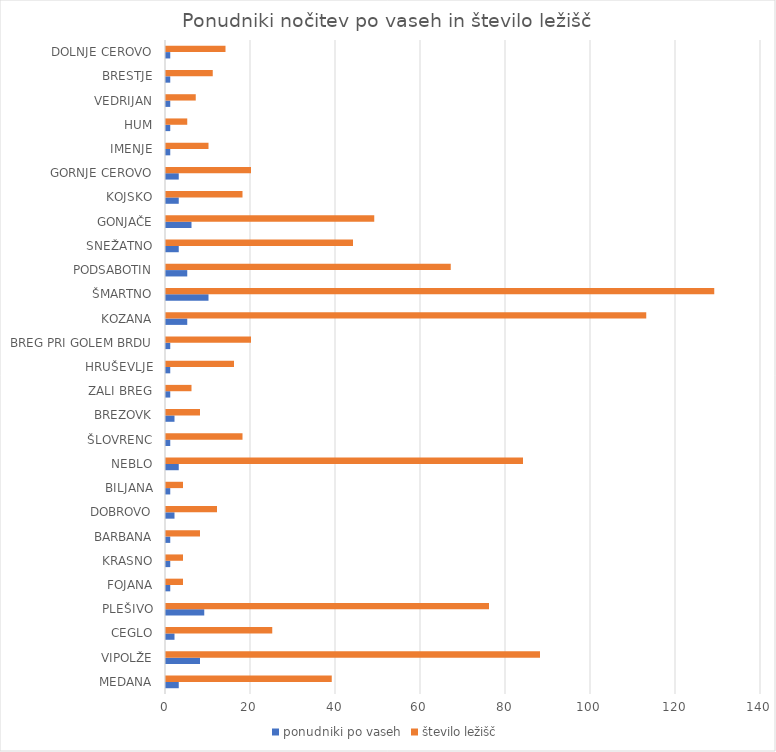
| Category | ponudniki po vaseh | število ležišč |
|---|---|---|
| MEDANA | 3 | 39 |
| VIPOLŽE | 8 | 88 |
| CEGLO | 2 | 25 |
| PLEŠIVO | 9 | 76 |
| FOJANA | 1 | 4 |
| KRASNO | 1 | 4 |
| BARBANA | 1 | 8 |
| DOBROVO | 2 | 12 |
| BILJANA | 1 | 4 |
| NEBLO | 3 | 84 |
| ŠLOVRENC | 1 | 18 |
| BREZOVK | 2 | 8 |
| ZALI BREG | 1 | 6 |
| HRUŠEVLJE | 1 | 16 |
| BREG PRI GOLEM BRDU | 1 | 20 |
| KOZANA | 5 | 113 |
| ŠMARTNO | 10 | 129 |
| PODSABOTIN | 5 | 67 |
| SNEŽATNO | 3 | 44 |
| GONJAČE | 6 | 49 |
| KOJSKO | 3 | 18 |
| GORNJE CEROVO | 3 | 20 |
| IMENJE | 1 | 10 |
| HUM | 1 | 5 |
| VEDRIJAN | 1 | 7 |
| BRESTJE | 1 | 11 |
| DOLNJE CEROVO | 1 | 14 |